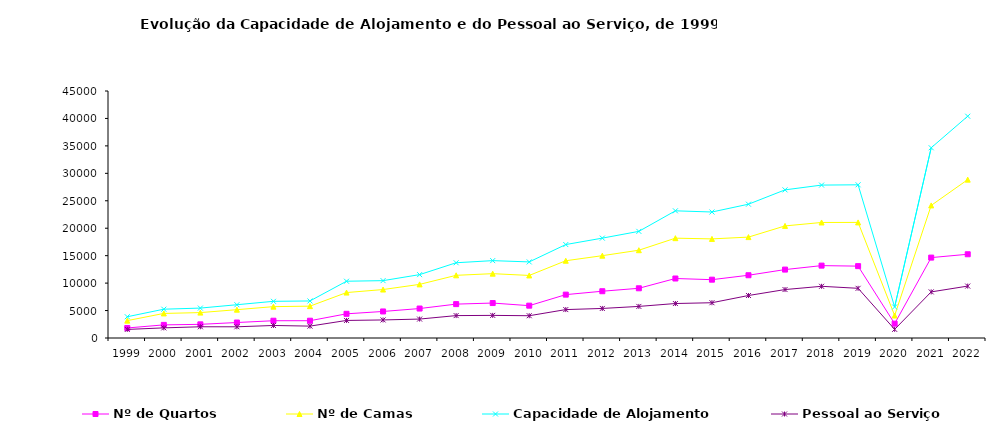
| Category | Nº de Quartos | Nº de Camas | Capacidade de Alojamento | Pessoal ao Serviço |
|---|---|---|---|---|
| 0 | 1825 | 3165 | 3874 | 1561 |
| 1 | 2391 | 4475 | 5249 | 1845 |
| 2 | 2489 | 4628 | 5450 | 2046 |
| 3 | 2820 | 5159 | 6062 | 2043 |
| 4 | 3146 | 5715 | 6682 | 2281 |
| 5 | 3150 | 5804 | 6749 | 2165 |
| 6 | 4406 | 8278 | 10342 | 3199 |
| 7 | 4836 | 8828 | 10450 | 3290 |
| 8 | 5368 | 9767 | 11544 | 3450 |
| 9 | 6172 | 11420 | 13708 | 4081 |
| 10 | 6367 | 11720 | 14096 | 4120 |
| 11 | 5891 | 11397 | 13862 | 4058 |
| 12 | 7901 | 14076 | 17025 | 5178 |
| 13 | 8522 | 14999 | 18194 | 5385 |
| 14 | 9058 | 15995 | 19428 | 5755 |
| 15 | 10839 | 18188 | 23171 | 6282 |
| 16 | 10626 | 18055 | 22954 | 6426 |
| 17 | 11435 | 18382 | 24376 | 7742 |
| 18 | 12463 | 20421 | 26987 | 8825 |
| 19 | 13187 | 21046 | 27860 | 9417 |
| 20 | 13092 | 21059 | 27911 | 9050 |
| 21 | 2614 | 4094 | 5655 | 1577 |
| 22 | 14648 | 24156 | 34656 | 8400 |
| 23 | 15257 | 28851 | 40403 | 9458 |